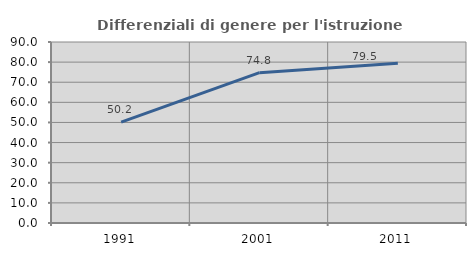
| Category | Differenziali di genere per l'istruzione superiore |
|---|---|
| 1991.0 | 50.172 |
| 2001.0 | 74.754 |
| 2011.0 | 79.457 |